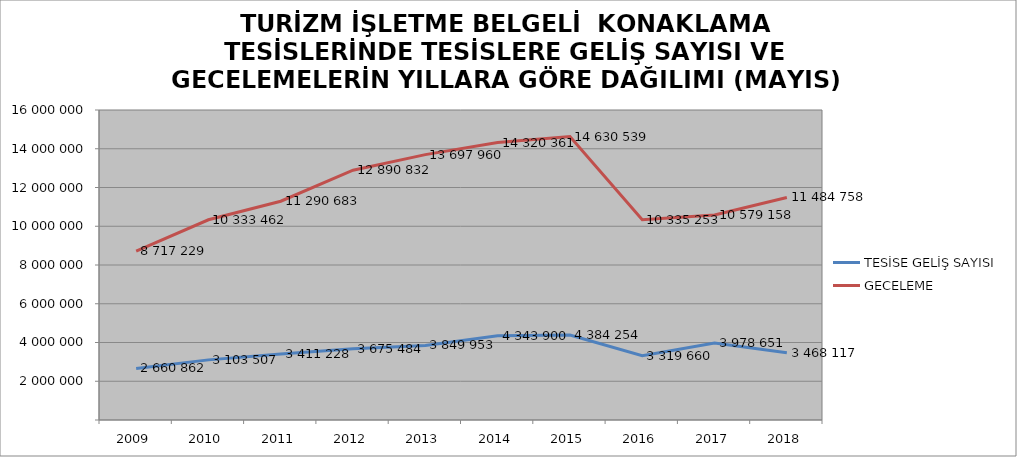
| Category | TESİSE GELİŞ SAYISI | GECELEME |
|---|---|---|
| 2009 | 2660862 | 8717229 |
| 2010 | 3103507 | 10333462 |
| 2011 | 3411228 | 11290683 |
| 2012 | 3675484 | 12890832 |
| 2013 | 3849953 | 13697960 |
| 2014 | 4343900 | 14320361 |
| 2015 | 4384254 | 14630539 |
| 2016 | 3319660 | 10335253 |
| 2017 | 3978651 | 10579158 |
| 2018 | 3468117 | 11484758 |